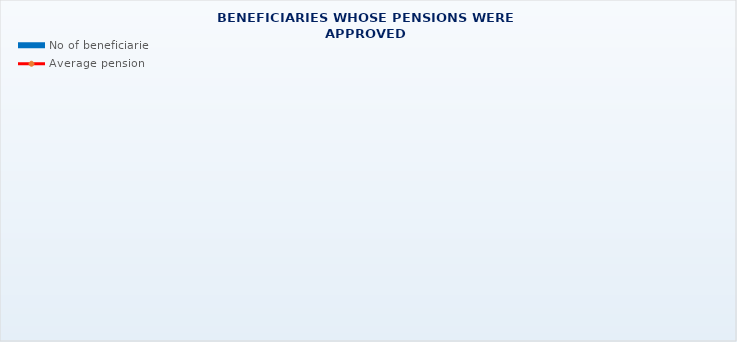
| Category | No of beneficiaries |
|---|---|
| Authorised officials in internal affairs, judicial officers and workers engaged in demining work: | 17264 |
| Pension beneficiaries entitled under the Fire Services Act (Official Gazette 125/19)* | 193 |
| Active military personnel - DVO  | 15881 |
| Croatian Homeland Army veterans mobilised from 1941 to 1945 | 2682 |
| Former political prisoners | 2387 |
| Croatian Veterans from the Homeland War - ZOHBDR (Act on Croatian Homeland War Veterans and Their Family Members) | 70836 |
| Pensions approved under general regulations and determined according to the Act on the Rights of Croatian Homeland War Veterans and their Family Members (ZOHBDR), in 2017 (Art. 27, 35, 48 and 49, paragraph 2)    | 51725 |
| Former Yugoslav People's Army members - JNA   | 4401 |
| Former Yugoslav People's Army members - JNA - Art. 185 of Pension Insurance Act (ZOMO)  | 157 |
| National Liberation War veterans - NOR | 6710 |
| Members of the Croatian Parliament, members of the Government, judges of the Constitutional Court and the Auditor General | 682 |
| Members of the Parliamentary Executive Council and administratively retired federal civil servants  (relates to the former SFRY) | 77 |
| Former officials of federal bodies o the former SFRJ -  Article 38 of the Pension Insurance Act (ZOMO) | 26 |
| Full members of the Croatian Academy of Sciences and Arts - HAZU | 132 |
| Miners from the Istrian coal mines "Tupljak" d.d. Labin  | 246 |
| Workers professionally exposed to asbestos | 851 |
| Insurees - crew members on a ship in international and national navigation  - Article  129, paragraph 2 of the Maritime Code | 200 |
| Members of the Croatian Defence Council - HVO  | 6788 |